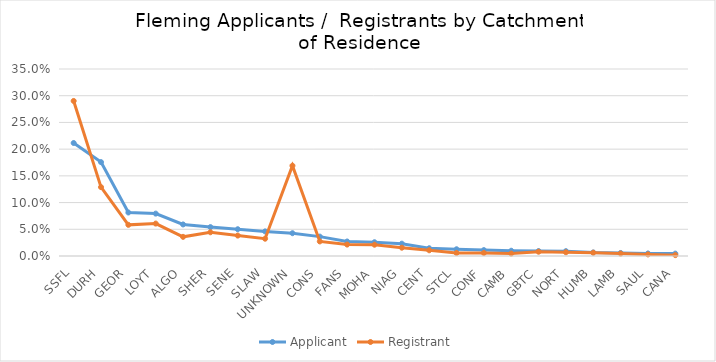
| Category | Applicant | Registrant |
|---|---|---|
| SSFL | 0.211 | 0.29 |
| DURH | 0.176 | 0.129 |
| GEOR | 0.081 | 0.058 |
| LOYT | 0.079 | 0.061 |
| ALGO | 0.059 | 0.036 |
| SHER | 0.054 | 0.044 |
| SENE | 0.05 | 0.038 |
| SLAW | 0.046 | 0.032 |
| UNKNOWN | 0.043 | 0.169 |
| CONS | 0.036 | 0.027 |
| FANS | 0.027 | 0.021 |
| MOHA | 0.026 | 0.021 |
| NIAG | 0.023 | 0.016 |
| CENT | 0.015 | 0.011 |
| STCL | 0.013 | 0.006 |
| CONF | 0.011 | 0.006 |
| CAMB | 0.01 | 0.005 |
| GBTC | 0.009 | 0.008 |
| NORT | 0.009 | 0.007 |
| HUMB | 0.007 | 0.006 |
| LAMB | 0.006 | 0.005 |
| SAUL | 0.005 | 0.003 |
| CANA | 0.004 | 0.002 |